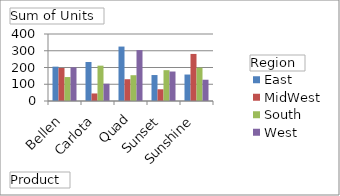
| Category | East | MidWest | South | West |
|---|---|---|---|---|
| Bellen | 205 | 197 | 143 | 201 |
| Carlota | 233 | 45 | 211 | 103 |
| Quad | 325 | 130 | 154 | 304 |
| Sunset | 155 | 70 | 184 | 176 |
| Sunshine | 158 | 281 | 199 | 127 |